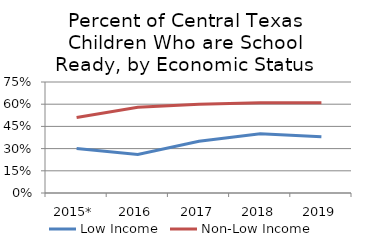
| Category | Low Income | Non-Low Income |
|---|---|---|
| 2015* | 0.3 | 0.51 |
| 2016 | 0.26 | 0.58 |
| 2017 | 0.35 | 0.6 |
| 2018 | 0.4 | 0.61 |
| 2019 | 0.38 | 0.61 |